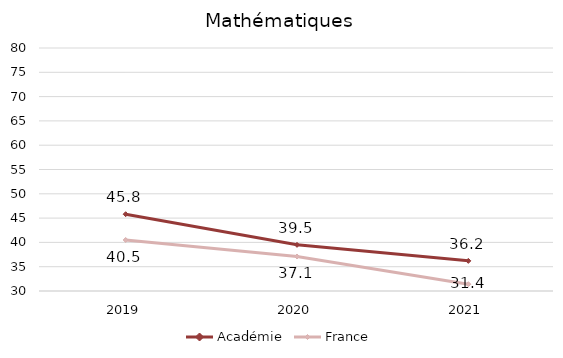
| Category | Académie | France |
|---|---|---|
| 2019.0 | 45.8 | 40.5 |
| 2020.0 | 39.5 | 37.1 |
| 2021.0 | 36.2 | 31.4 |